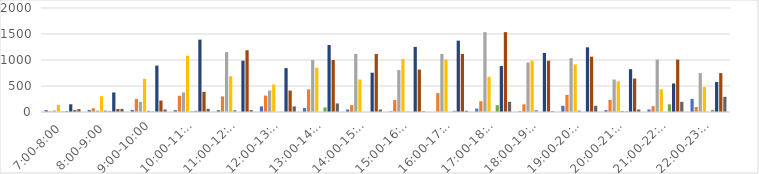
| Category | Series 0 | Series 1 | Series 2 | Series 3 | Series 4 | Series 5 | Series 6 | Series 7 | Series 8 |
|---|---|---|---|---|---|---|---|---|---|
| 7:00-8:00 | 36 | 12 | 28 | 136 | 8 | 20 | 148 | 36 | 56 |
| 8:00-9:00 | 40 | 72 | 28 | 304 | 28 | 20 | 376 | 56 | 60 |
| 9:00-10:00 | 40 | 252 | 196 | 640 | 24 | 8 | 892 | 220 | 48 |
| 10:00-11:00 | 36 | 312 | 376 | 1080 | 12 | 24 | 1392 | 388 | 60 |
| 11:00-12:00 | 36 | 300 | 1152 | 688 | 36 | 0 | 988 | 1188 | 36 |
| 12:00-13:00 | 108 | 316 | 412 | 528 | 0 | 0 | 844 | 412 | 108 |
| 13:00-14:00 | 76 | 436 | 1000 | 852 | 0 | 88 | 1288 | 1000 | 164 |
| 14:00-15:00 | 48 | 132 | 1116 | 624 | 0 | 0 | 756 | 1116 | 48 |
| 15:00-16:00 | 12 | 232 | 808 | 1020 | 8 | 0 | 1252 | 816 | 12 |
| 16:00-17:00 | 0 | 364 | 1116 | 1008 | 0 | 24 | 1372 | 1116 | 24 |
| 17:00-18:00 | 64 | 208 | 1536 | 676 | 0 | 132 | 884 | 1536 | 196 |
| 18:00-19:00 | 12 | 148 | 952 | 988 | 36 | 0 | 1136 | 988 | 12 |
| 19:00-20:00 | 120 | 328 | 1036 | 916 | 28 | 0 | 1244 | 1064 | 120 |
| 20:00-21:00 | 36 | 232 | 624 | 592 | 20 | 12 | 824 | 644 | 48 |
| 21:00-22:00 | 48 | 112 | 1008 | 436 | 0 | 148 | 548 | 1008 | 196 |
| 22:00-23:00 | 252 | 96 | 748 | 480 | 0 | 40 | 576 | 748 | 292 |